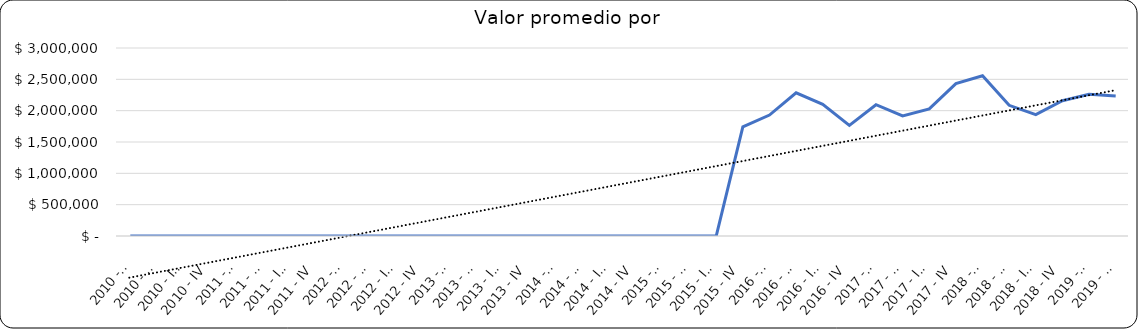
| Category | Valor m2 en Bogotá por sectores |
|---|---|
| 2010 - I | 0 |
| 2010 - II | 0 |
| 2010 - III | 0 |
| 2010 - IV | 0 |
| 2011 - I | 0 |
| 2011 - II | 0 |
| 2011 - III | 0 |
| 2011 - IV | 0 |
| 2012 - I | 0 |
| 2012 - II | 0 |
| 2012 - III | 0 |
| 2012 - IV | 0 |
| 2013 - I | 0 |
| 2013 - II | 0 |
| 2013 - III | 0 |
| 2013 - IV | 0 |
| 2014 - I | 0 |
| 2014 - II | 0 |
| 2014 - III | 0 |
| 2014 - IV | 0 |
| 2015 - I | 0 |
| 2015 - II | 0 |
| 2015 - III | 0 |
| 2015 - IV | 1741816.092 |
| 2016 - I | 1929629.63 |
| 2016 - II | 2285185.185 |
| 2016 - III | 2101449.275 |
| 2016 - IV | 1765957.447 |
| 2017 - I | 2094814.815 |
| 2017 - II | 1917562.724 |
| 2017 - III | 2028469.751 |
| 2017 - IV | 2432539.683 |
| 2018 - I | 2558139.535 |
| 2018 - II | 2085106.383 |
| 2018 - III | 1936170 |
| 2018 - IV | 2159574 |
| 2019 - I | 2260870 |
| 2019 - II | 2232558 |